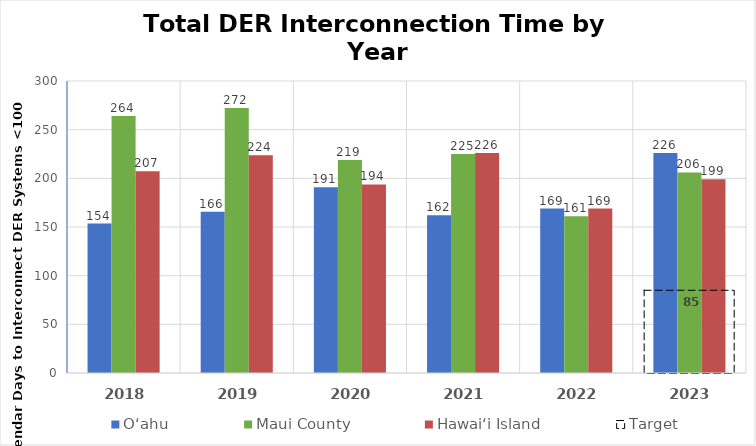
| Category | Oʻahu | Maui County | Hawai‘i Island |
|---|---|---|---|
| 2018.0 | 153.585 | 264 | 207.269 |
| 2019.0 | 165.598 | 272.371 | 223.702 |
| 2020.0 | 190.772 | 218.815 | 193.731 |
| 2021.0 | 162 | 225 | 226 |
| 2022.0 | 169 | 161 | 169 |
| 2023.0 | 226 | 206 | 199 |